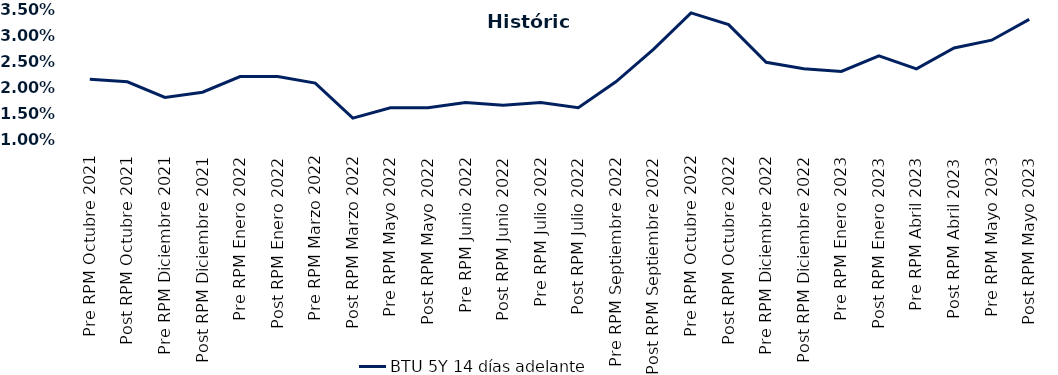
| Category | BTU 5Y 14 días adelante |
|---|---|
| Pre RPM Octubre 2021 | 0.022 |
| Post RPM Octubre 2021 | 0.021 |
| Pre RPM Diciembre 2021 | 0.018 |
| Post RPM Diciembre 2021 | 0.019 |
| Pre RPM Enero 2022 | 0.022 |
| Post RPM Enero 2022 | 0.022 |
| Pre RPM Marzo 2022 | 0.021 |
| Post RPM Marzo 2022 | 0.014 |
| Pre RPM Mayo 2022 | 0.016 |
| Post RPM Mayo 2022 | 0.016 |
| Pre RPM Junio 2022 | 0.017 |
| Post RPM Junio 2022 | 0.016 |
| Pre RPM Julio 2022 | 0.017 |
| Post RPM Julio 2022 | 0.016 |
| Pre RPM Septiembre 2022 | 0.021 |
| Post RPM Septiembre 2022 | 0.027 |
| Pre RPM Octubre 2022 | 0.034 |
| Post RPM Octubre 2022 | 0.032 |
| Pre RPM Diciembre 2022 | 0.025 |
| Post RPM Diciembre 2022 | 0.024 |
| Pre RPM Enero 2023 | 0.023 |
| Post RPM Enero 2023 | 0.026 |
| Pre RPM Abril 2023 | 0.024 |
| Post RPM Abril 2023 | 0.028 |
| Pre RPM Mayo 2023 | 0.029 |
| Post RPM Mayo 2023 | 0.033 |